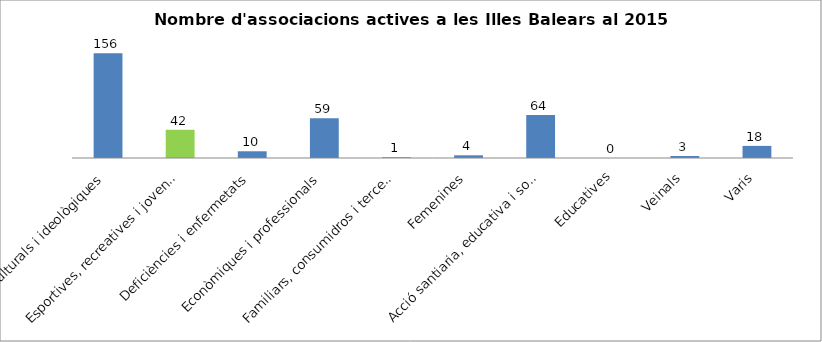
| Category | Series 0 |
|---|---|
| Culturals i ideològiques | 156 |
| Esportives, recreatives i joventut | 42 |
| Deficiències i enfermetats | 10 |
| Econòmiques i professionals | 59 |
| Familiars, consumidros i tercera edat | 1 |
| Femenines | 4 |
| Acció santiaria, educativa i social | 64 |
| Educatives | 0 |
| Veinals | 3 |
| Varis | 18 |